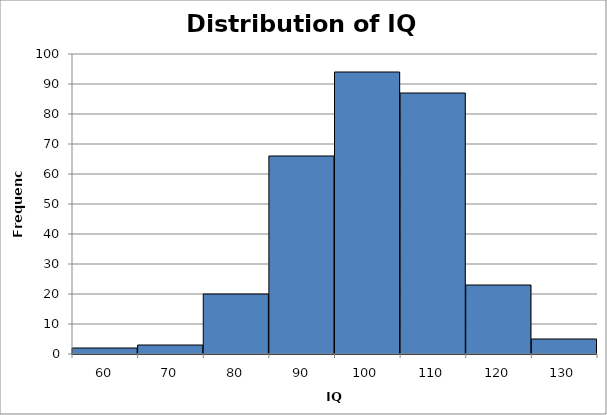
| Category | Series 0 |
|---|---|
| 60.0 | 2 |
| 70.0 | 3 |
| 80.0 | 20 |
| 90.0 | 66 |
| 100.0 | 94 |
| 110.0 | 87 |
| 120.0 | 23 |
| 130.0 | 5 |